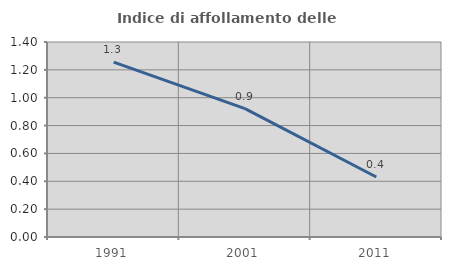
| Category | Indice di affollamento delle abitazioni  |
|---|---|
| 1991.0 | 1.255 |
| 2001.0 | 0.922 |
| 2011.0 | 0.431 |